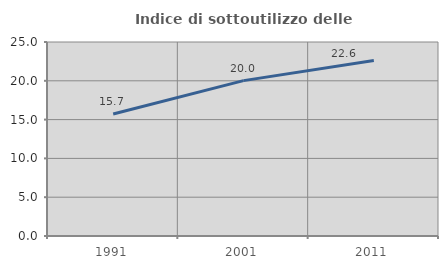
| Category | Indice di sottoutilizzo delle abitazioni  |
|---|---|
| 1991.0 | 15.728 |
| 2001.0 | 20.022 |
| 2011.0 | 22.611 |